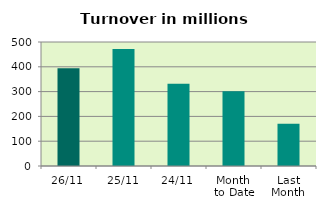
| Category | Series 0 |
|---|---|
| 26/11 | 394.395 |
| 25/11 | 471.997 |
| 24/11 | 331.931 |
| Month 
to Date | 301.884 |
| Last
Month | 170.355 |